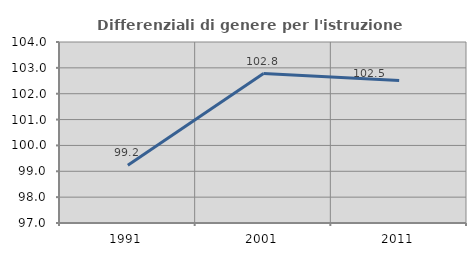
| Category | Differenziali di genere per l'istruzione superiore |
|---|---|
| 1991.0 | 99.23 |
| 2001.0 | 102.779 |
| 2011.0 | 102.509 |